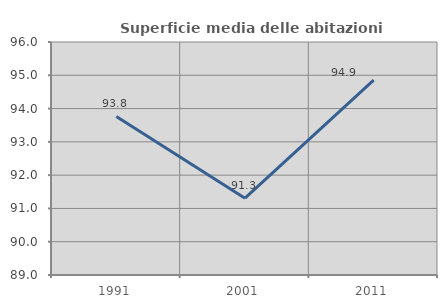
| Category | Superficie media delle abitazioni occupate |
|---|---|
| 1991.0 | 93.764 |
| 2001.0 | 91.307 |
| 2011.0 | 94.853 |